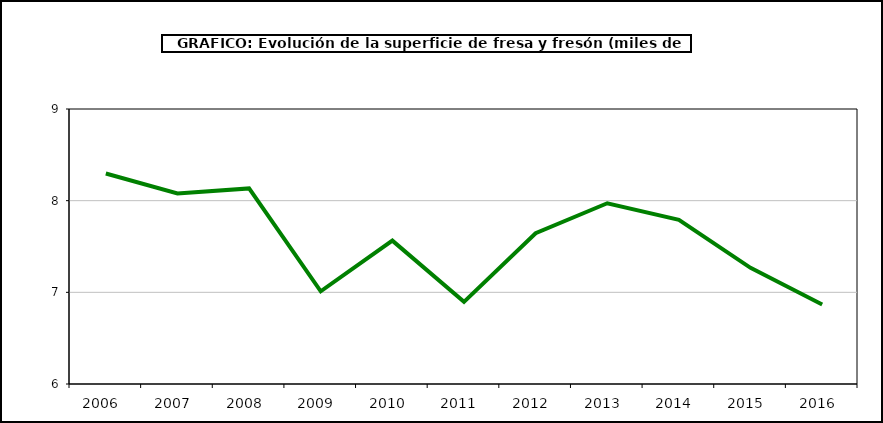
| Category | superficie |
|---|---|
| 2006.0 | 8.296 |
| 2007.0 | 8.078 |
| 2008.0 | 8.134 |
| 2009.0 | 7.011 |
| 2010.0 | 7.564 |
| 2011.0 | 6.896 |
| 2012.0 | 7.645 |
| 2013.0 | 7.972 |
| 2014.0 | 7.791 |
| 2015.0 | 7.267 |
| 2016.0 | 6.867 |